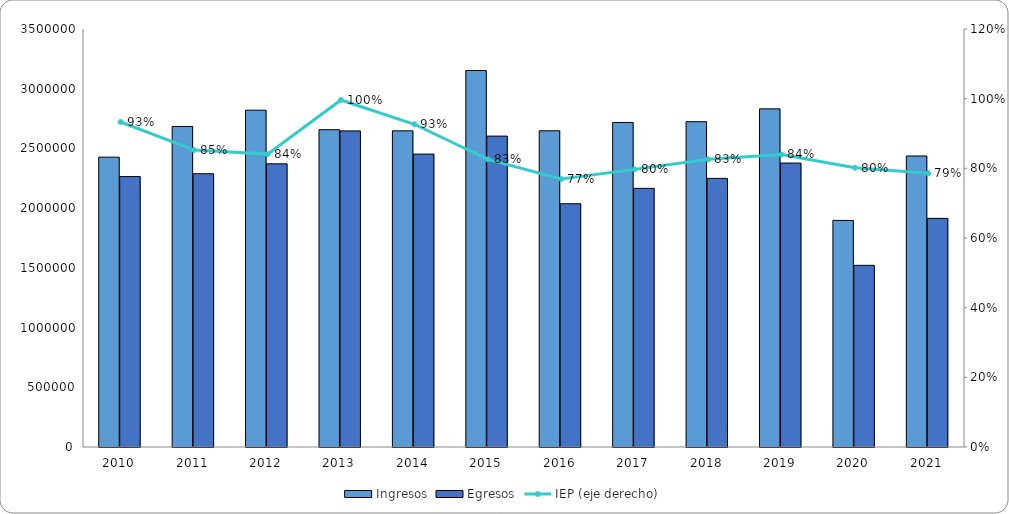
| Category | Ingresos | Egresos |
|---|---|---|
| 2010.0 | 2426938 | 2264467 |
| 2011.0 | 2684094 | 2288196 |
| 2012.0 | 2820229 | 2371286 |
| 2013.0 | 2656779 | 2646903 |
| 2014.0 | 2647245 | 2452671 |
| 2015.0 | 3152339 | 2603282 |
| 2016.0 | 2647666 | 2036849 |
| 2017.0 | 2717444 | 2165848 |
| 2018.0 | 2723771 | 2249181 |
| 2019.0 | 2831240 | 2377526 |
| 2020.0 | 1897244 | 1521088 |
| 2021.0 | 2436759 | 1914407 |